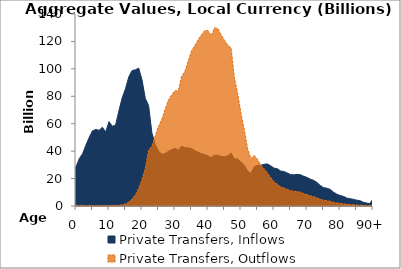
| Category | Private Transfers, Inflows | Private Transfers, Outflows |
|---|---|---|
| 0 | 28552.893 | 473.047 |
|  | 34601.158 | 523.216 |
| 2 | 38144.047 | 421.71 |
| 3 | 44400.48 | 318.896 |
| 4 | 49986.93 | 229.66 |
| 5 | 54837.018 | 176.116 |
| 6 | 55821.15 | 160.234 |
| 7 | 55174.977 | 190.245 |
| 8 | 57399.849 | 243.205 |
| 9 | 54009.706 | 255.794 |
| 10 | 61524.586 | 323.335 |
| 11 | 58156.328 | 339.365 |
| 12 | 59013.813 | 370.165 |
| 13 | 69489.388 | 507.309 |
| 14 | 78799.924 | 843.437 |
| 15 | 85634.235 | 1469.94 |
| 16 | 94157.145 | 2845.863 |
| 17 | 98787.267 | 5156.691 |
| 18 | 99276.167 | 8101.616 |
| 19 | 100565.503 | 12849.852 |
| 20 | 92016.727 | 19286.456 |
| 21 | 78498.171 | 27369.418 |
| 22 | 73354.488 | 40555.288 |
| 23 | 53302.387 | 43652.059 |
| 24 | 44919.206 | 51036.203 |
| 25 | 40091.4 | 57878.815 |
| 26 | 37735.68 | 63238.044 |
| 27 | 38268.85 | 70369.92 |
| 28 | 39844.538 | 77123.367 |
| 29 | 41091.813 | 80996.58 |
| 30 | 42001.373 | 84058.432 |
| 31 | 40654.581 | 83855.292 |
| 32 | 43702.045 | 94447.005 |
| 33 | 42509.317 | 98007.027 |
| 34 | 42352.784 | 105577.473 |
| 35 | 41854.985 | 113071.942 |
| 36 | 40448.771 | 116910.301 |
| 37 | 39225.657 | 121126.958 |
| 38 | 38134.955 | 124809.153 |
| 39 | 37561.451 | 127827.15 |
| 40 | 36490.387 | 128003.18 |
| 41 | 35300.855 | 124085.784 |
| 42 | 37101.067 | 129930.895 |
| 43 | 37066.387 | 129356.924 |
| 44 | 36118.556 | 124670.447 |
| 45 | 35921.713 | 120805.113 |
| 46 | 36631.248 | 117228.327 |
| 47 | 38604.19 | 115251.318 |
| 48 | 34322.09 | 93404.467 |
| 49 | 34253.643 | 81986.347 |
| 50 | 32042.75 | 67495.905 |
| 51 | 29803.318 | 55554.727 |
| 52 | 25399.246 | 41719.361 |
| 53 | 23783.357 | 34523.259 |
| 54 | 28611.304 | 36849.657 |
| 55 | 29761.973 | 34030.864 |
| 56 | 29727.418 | 29947.43 |
| 57 | 30460.242 | 27098.952 |
| 58 | 30646.316 | 24205.334 |
| 59 | 29322.241 | 20682.702 |
| 60 | 27585.419 | 17613.266 |
| 61 | 27181.228 | 15921.075 |
| 62 | 25543.174 | 13944.005 |
| 63 | 25158.398 | 13104.71 |
| 64 | 24082 | 12155.637 |
| 65 | 22946.839 | 11231.21 |
| 66 | 22695.215 | 10754.06 |
| 67 | 23020.476 | 10501.084 |
| 68 | 22812.406 | 9992.827 |
| 69 | 21669.948 | 9062.659 |
| 70 | 20817.189 | 8283.739 |
| 71 | 19566.918 | 7456.307 |
| 72 | 18746.425 | 6828.677 |
| 73 | 17195.84 | 5948.44 |
| 74 | 14997.061 | 4952.996 |
| 75 | 13425.783 | 4208.144 |
| 76 | 12956.062 | 3851.736 |
| 77 | 12145.964 | 3431.604 |
| 78 | 10133.936 | 2730.586 |
| 79 | 8687.686 | 2234.085 |
| 80 | 7660.85 | 1886.556 |
| 81 | 7043.8 | 1628.44 |
| 82 | 5861.686 | 1261.796 |
| 83 | 5323.657 | 1066.617 |
| 84 | 4912.591 | 915.882 |
| 85 | 4265.113 | 733.045 |
| 86 | 3962.933 | 624.811 |
| 87 | 2778.18 | 399.278 |
| 88 | 2217.976 | 275.715 |
| 89 | 1771.469 | 195.932 |
| 90+ | 5008.861 | 482.244 |